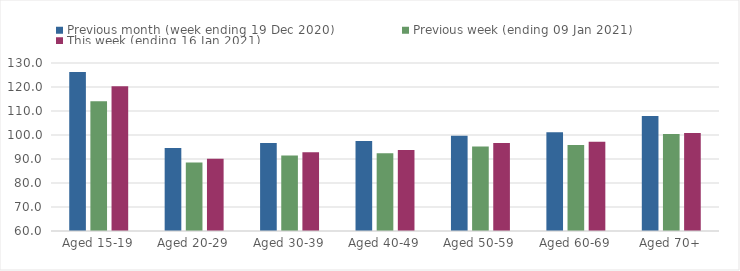
| Category | Previous month (week ending 19 Dec 2020) | Previous week (ending 09 Jan 2021) | This week (ending 16 Jan 2021) |
|---|---|---|---|
| Aged 15-19 | 126.27 | 114.07 | 120.32 |
| Aged 20-29 | 94.62 | 88.51 | 90.11 |
| Aged 30-39 | 96.62 | 91.5 | 92.78 |
| Aged 40-49 | 97.48 | 92.41 | 93.74 |
| Aged 50-59 | 99.7 | 95.23 | 96.66 |
| Aged 60-69 | 101.1 | 95.86 | 97.23 |
| Aged 70+ | 107.91 | 100.4 | 100.85 |